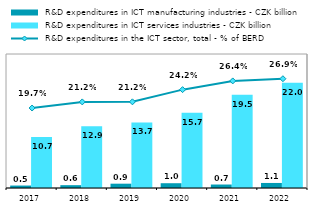
| Category |  R&D expenditures in ICT manufacturing industries - CZK billion |  R&D expenditures in ICT services industries - CZK billion |
|---|---|---|
| 2017.0 | 0.512 | 10.677 |
| 2018.0 | 0.591 | 12.903 |
| 2019.0 | 0.902 | 13.698 |
| 2020.0 | 0.999 | 15.74 |
| 2021.0 | 0.727 | 19.463 |
| 2022.0 | 1.054 | 21.982 |